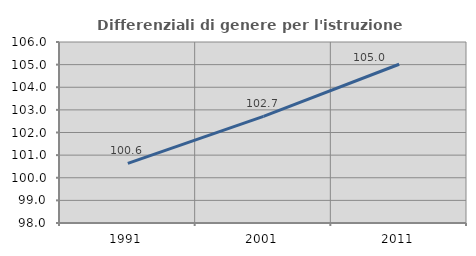
| Category | Differenziali di genere per l'istruzione superiore |
|---|---|
| 1991.0 | 100.636 |
| 2001.0 | 102.713 |
| 2011.0 | 105.017 |